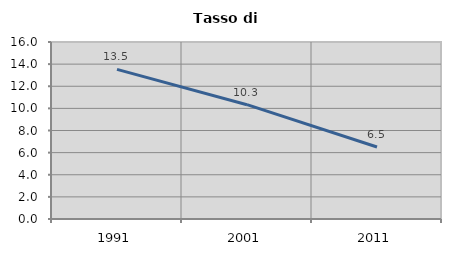
| Category | Tasso di disoccupazione   |
|---|---|
| 1991.0 | 13.527 |
| 2001.0 | 10.333 |
| 2011.0 | 6.509 |